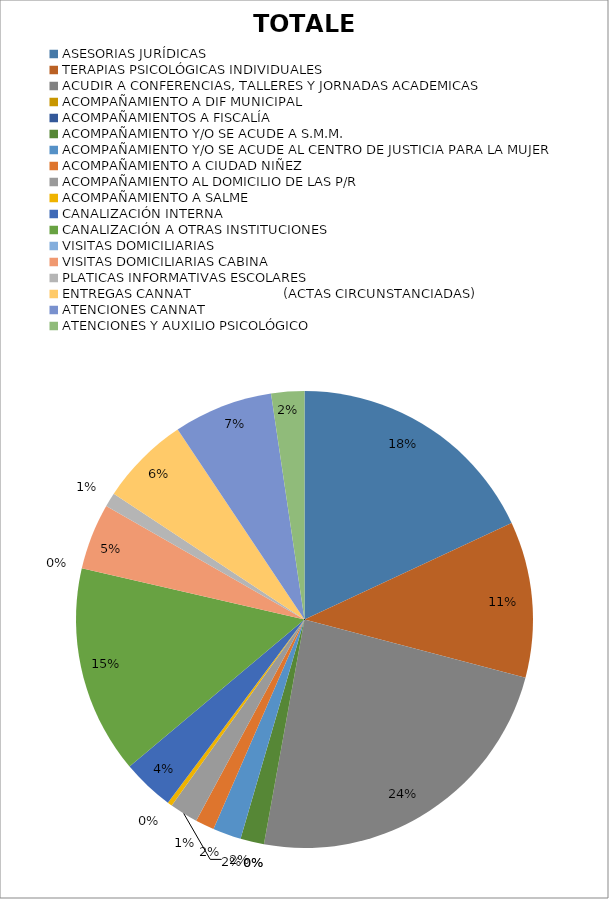
| Category | TOTALES |
|---|---|
| ASESORIAS JURÍDICAS | 54 |
| TERAPIAS PSICOLÓGICAS INDIVIDUALES | 33 |
| ACUDIR A CONFERENCIAS, TALLERES Y JORNADAS ACADEMICAS | 71 |
| ACOMPAÑAMIENTO A DIF MUNICIPAL | 0 |
| ACOMPAÑAMIENTOS A FISCALÍA | 0 |
| ACOMPAÑAMIENTO Y/O SE ACUDE A S.M.M. | 5 |
| ACOMPAÑAMIENTO Y/O SE ACUDE AL CENTRO DE JUSTICIA PARA LA MUJER | 6 |
| ACOMPAÑAMIENTO A CIUDAD NIÑEZ  | 4 |
| ACOMPAÑAMIENTO AL DOMICILIO DE LAS P/R | 6 |
| ACOMPAÑAMIENTO A SALME | 1 |
| CANALIZACIÓN INTERNA | 11 |
| CANALIZACIÓN A OTRAS INSTITUCIONES | 44 |
| VISITAS DOMICILIARIAS | 0 |
| VISITAS DOMICILIARIAS CABINA | 14 |
| PLATICAS INFORMATIVAS ESCOLARES | 3 |
| ENTREGAS CANNAT                       (ACTAS CIRCUNSTANCIADAS) | 19 |
| ATENCIONES CANNAT | 21 |
| ATENCIONES Y AUXILIO PSICOLÓGICO | 7 |